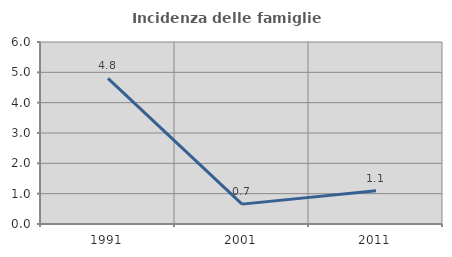
| Category | Incidenza delle famiglie numerose |
|---|---|
| 1991.0 | 4.798 |
| 2001.0 | 0.655 |
| 2011.0 | 1.097 |